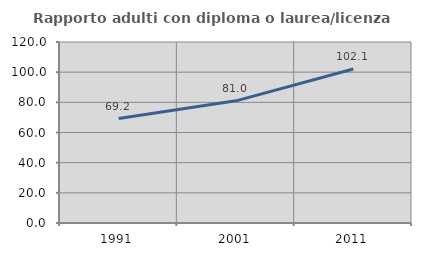
| Category | Rapporto adulti con diploma o laurea/licenza media  |
|---|---|
| 1991.0 | 69.231 |
| 2001.0 | 81 |
| 2011.0 | 102.062 |